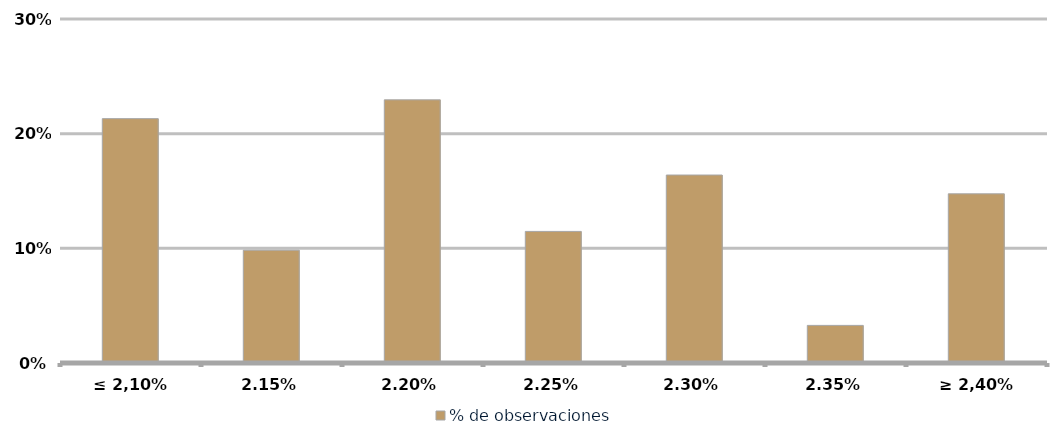
| Category | % de observaciones  |
|---|---|
| ≤ 2,10% | 0.213 |
| 2,15% | 0.098 |
| 2,20% | 0.23 |
| 2,25% | 0.115 |
| 2,30% | 0.164 |
| 2,35% | 0.033 |
| ≥ 2,40% | 0.148 |